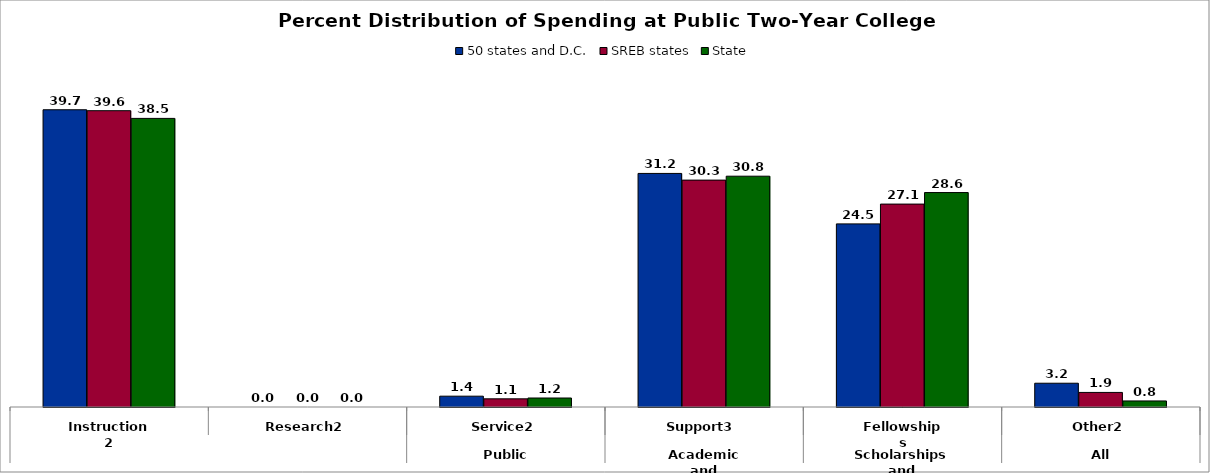
| Category | 50 states and D.C. | SREB states | State |
|---|---|---|---|
| 0 | 39.692 | 39.565 | 38.536 |
| 1 | 0 | 0 | 0 |
| 2 | 1.444 | 1.091 | 1.2 |
| 3 | 31.19 | 30.296 | 30.819 |
| 4 | 24.451 | 27.095 | 28.635 |
| 5 | 3.175 | 1.945 | 0.809 |